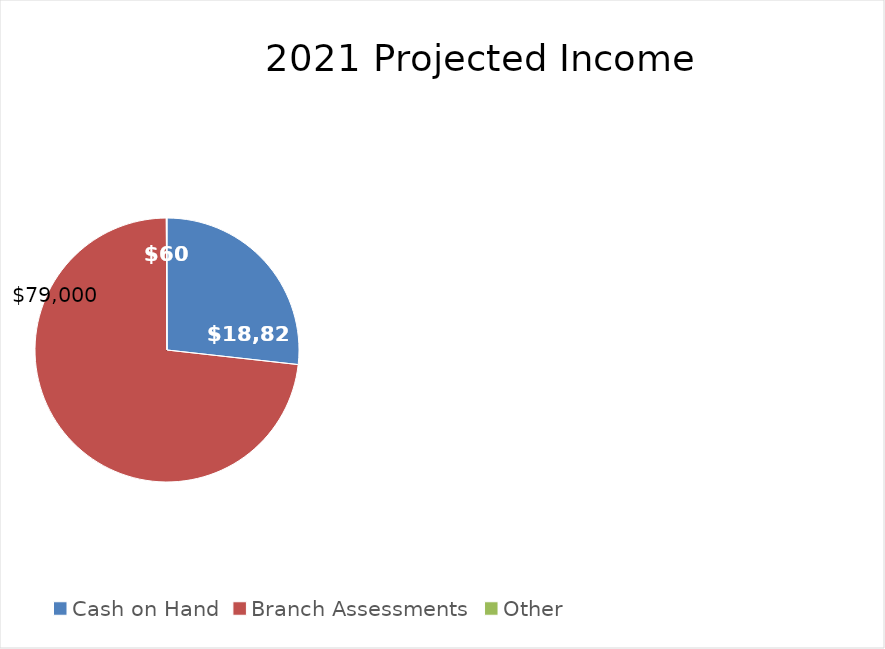
| Category | Series 0 |
|---|---|
| Cash on Hand | 18823 |
| Branch Assessments | 51457 |
| Other | 60 |